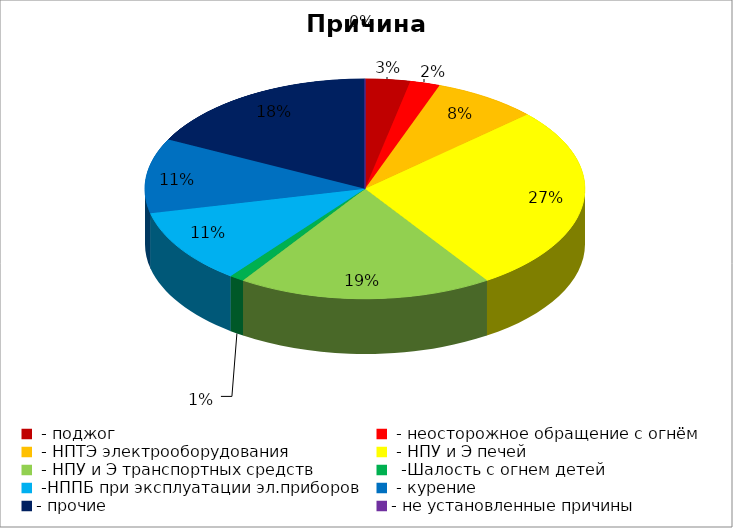
| Category | Причина пожара |
|---|---|
|  - поджог | 3 |
|  - неосторожное обращение с огнём | 2 |
|  - НПТЭ электрооборудования | 7 |
|  - НПУ и Э печей | 25 |
|  - НПУ и Э транспортных средств | 17 |
|   -Шалость с огнем детей | 1 |
|  -НППБ при эксплуатации эл.приборов | 10 |
|  - курение | 10 |
| - прочие | 16 |
| - не установленные причины | 0 |